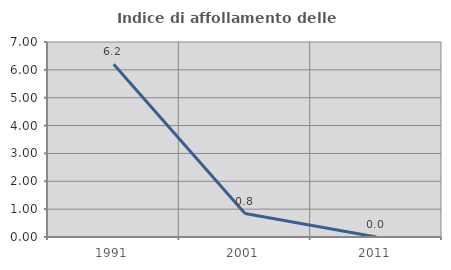
| Category | Indice di affollamento delle abitazioni  |
|---|---|
| 1991.0 | 6.202 |
| 2001.0 | 0.84 |
| 2011.0 | 0 |